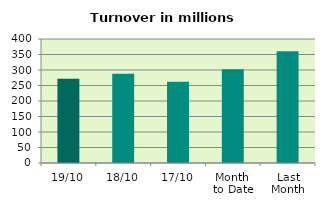
| Category | Series 0 |
|---|---|
| 19/10 | 271.572 |
| 18/10 | 287.558 |
| 17/10 | 262.402 |
| Month 
to Date | 302.265 |
| Last
Month | 360.198 |